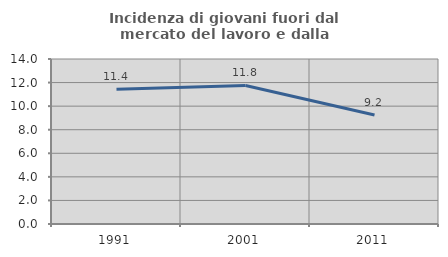
| Category | Incidenza di giovani fuori dal mercato del lavoro e dalla formazione  |
|---|---|
| 1991.0 | 11.435 |
| 2001.0 | 11.757 |
| 2011.0 | 9.242 |